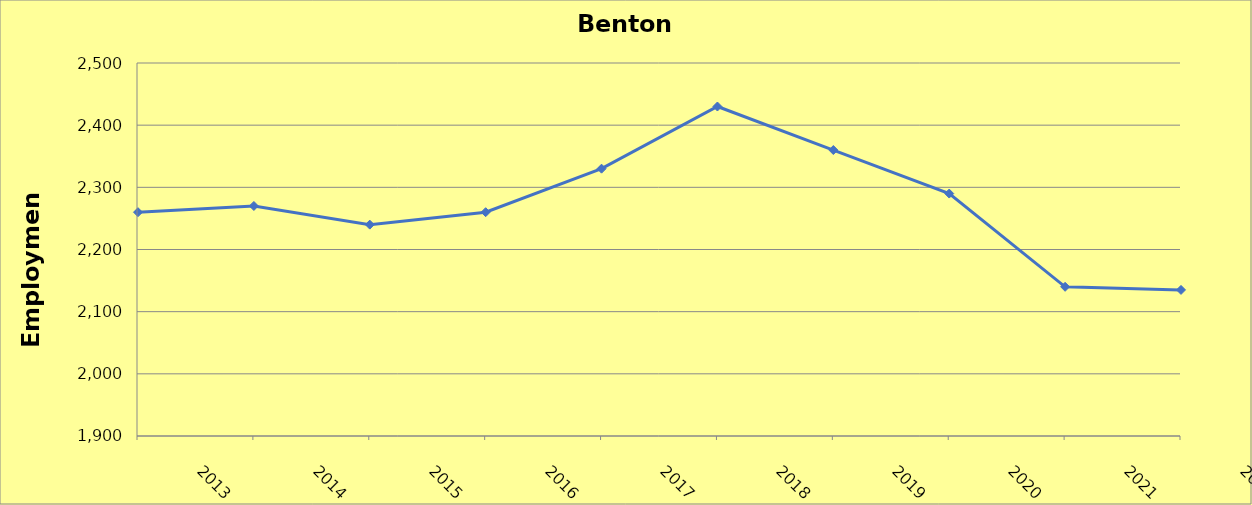
| Category | Benton County |
|---|---|
| 2013.0 | 2260 |
| 2014.0 | 2270 |
| 2015.0 | 2240 |
| 2016.0 | 2260 |
| 2017.0 | 2330 |
| 2018.0 | 2430 |
| 2019.0 | 2360 |
| 2020.0 | 2290 |
| 2021.0 | 2140 |
| 2022.0 | 2135 |